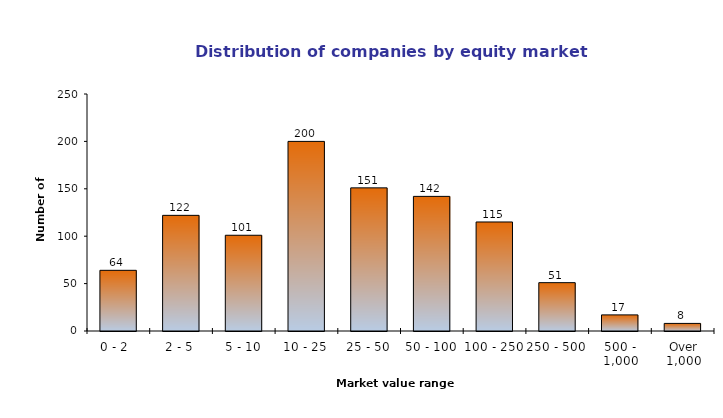
| Category | AIM |
|---|---|
| Over 1,000 | 8 |
| 500 - 1,000 | 17 |
| 250 - 500 | 51 |
| 100 - 250 | 115 |
| 50 - 100 | 142 |
| 25 - 50 | 151 |
| 10 - 25 | 200 |
| 5 - 10 | 101 |
| 2 - 5 | 122 |
| 0 - 2  | 64 |